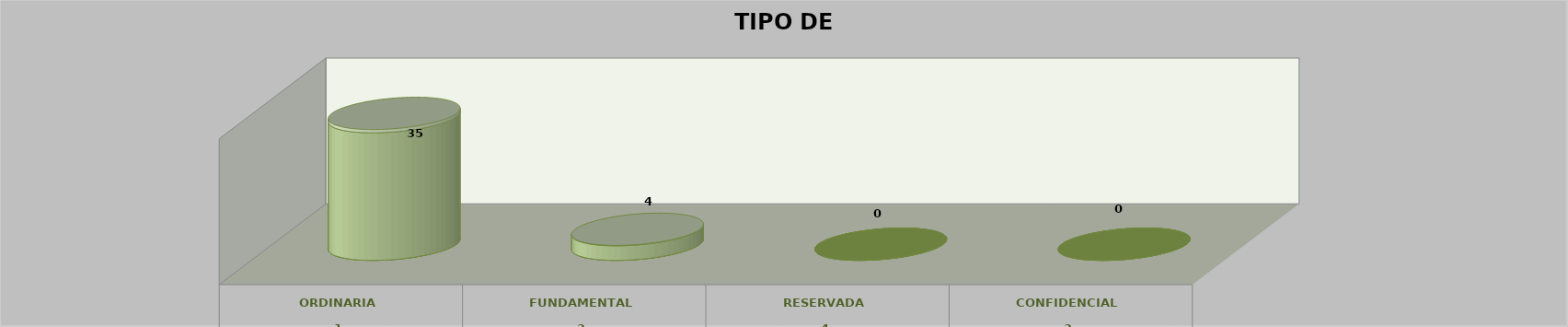
| Category | Series 0 | Series 1 | Series 2 | Series 3 | Series 4 |
|---|---|---|---|---|---|
| 0 |  |  |  | 35 | 0.897 |
| 1 |  |  |  | 4 | 0.103 |
| 2 |  |  |  | 0 | 0 |
| 3 |  |  |  | 0 | 0 |